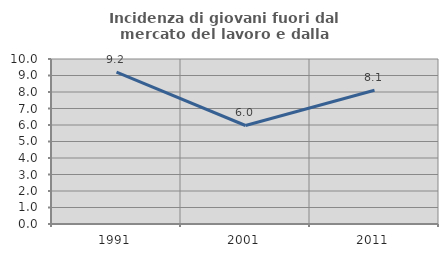
| Category | Incidenza di giovani fuori dal mercato del lavoro e dalla formazione  |
|---|---|
| 1991.0 | 9.211 |
| 2001.0 | 5.97 |
| 2011.0 | 8.108 |